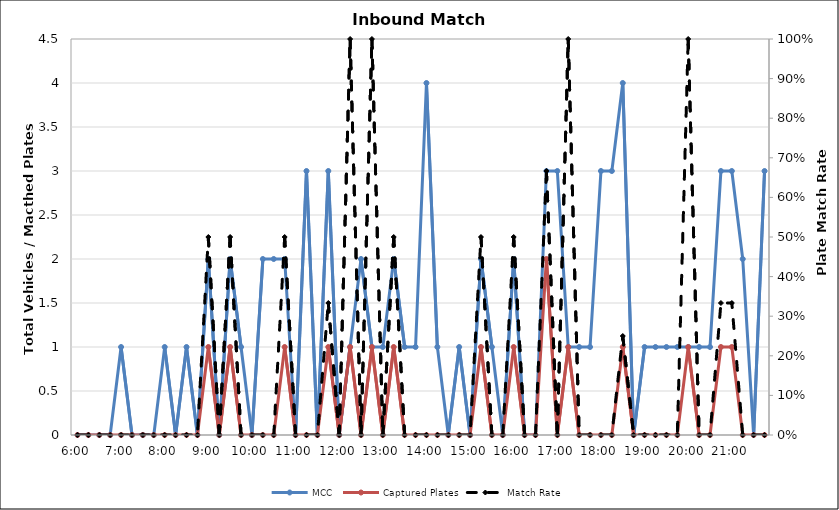
| Category | MCC | Captured Plates |
|---|---|---|
| 0.25 | 0 | 0 |
| 0.260416666666667 | 0 | 0 |
| 0.270833333333333 | 0 | 0 |
| 0.28125 | 0 | 0 |
| 0.291666666666667 | 1 | 0 |
| 0.302083333333333 | 0 | 0 |
| 0.3125 | 0 | 0 |
| 0.322916666666667 | 0 | 0 |
| 0.333333333333333 | 1 | 0 |
| 0.34375 | 0 | 0 |
| 0.354166666666667 | 1 | 0 |
| 0.364583333333333 | 0 | 0 |
| 0.375 | 2 | 1 |
| 0.385416666666667 | 0 | 0 |
| 0.395833333333333 | 2 | 1 |
| 0.40625 | 1 | 0 |
| 0.416666666666667 | 0 | 0 |
| 0.427083333333333 | 2 | 0 |
| 0.4375 | 2 | 0 |
| 0.447916666666667 | 2 | 1 |
| 0.458333333333333 | 0 | 0 |
| 0.46875 | 3 | 0 |
| 0.479166666666667 | 0 | 0 |
| 0.489583333333333 | 3 | 1 |
| 0.5 | 0 | 0 |
| 0.510416666666667 | 1 | 1 |
| 0.520833333333333 | 2 | 0 |
| 0.53125 | 1 | 1 |
| 0.541666666666667 | 1 | 0 |
| 0.552083333333333 | 2 | 1 |
| 0.5625 | 1 | 0 |
| 0.572916666666667 | 1 | 0 |
| 0.583333333333333 | 4 | 0 |
| 0.59375 | 1 | 0 |
| 0.604166666666667 | 0 | 0 |
| 0.614583333333333 | 1 | 0 |
| 0.625 | 0 | 0 |
| 0.635416666666667 | 2 | 1 |
| 0.645833333333333 | 1 | 0 |
| 0.65625 | 0 | 0 |
| 0.666666666666667 | 2 | 1 |
| 0.677083333333333 | 0 | 0 |
| 0.6875 | 0 | 0 |
| 0.697916666666667 | 3 | 2 |
| 0.708333333333333 | 3 | 0 |
| 0.71875 | 1 | 1 |
| 0.729166666666667 | 1 | 0 |
| 0.739583333333333 | 1 | 0 |
| 0.75 | 3 | 0 |
| 0.760416666666667 | 3 | 0 |
| 0.770833333333333 | 4 | 1 |
| 0.78125 | 0 | 0 |
| 0.791666666666667 | 1 | 0 |
| 0.802083333333333 | 1 | 0 |
| 0.8125 | 1 | 0 |
| 0.822916666666667 | 1 | 0 |
| 0.833333333333333 | 1 | 1 |
| 0.84375 | 1 | 0 |
| 0.854166666666667 | 1 | 0 |
| 0.864583333333333 | 3 | 1 |
| 0.875 | 3 | 1 |
| 0.885416666666667 | 2 | 0 |
| 0.895833333333333 | 0 | 0 |
| 0.90625 | 3 | 0 |